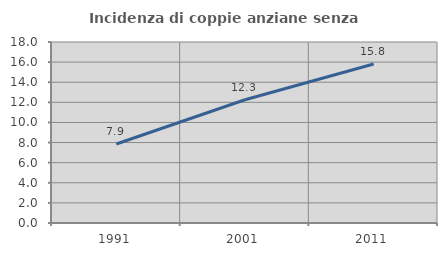
| Category | Incidenza di coppie anziane senza figli  |
|---|---|
| 1991.0 | 7.858 |
| 2001.0 | 12.261 |
| 2011.0 | 15.815 |